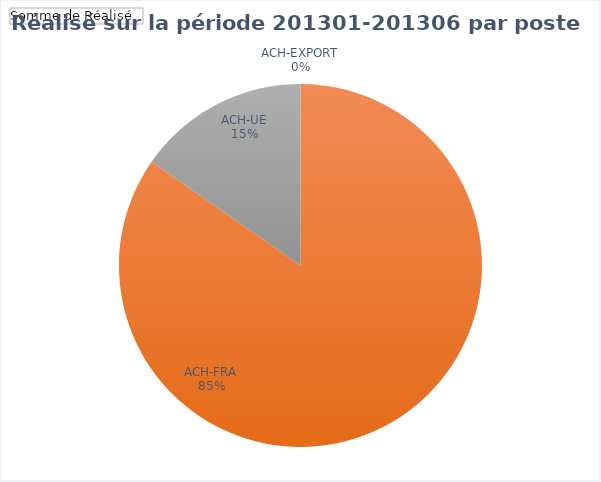
| Category | Total |
|---|---|
| ACH-EXPORT | 0 |
| ACH-FRA | 3249046.71 |
| ACH-UE | 587044.54 |